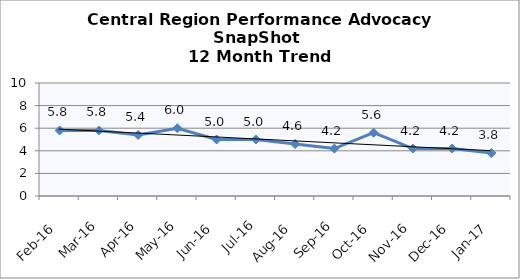
| Category | Central Region |
|---|---|
| Feb-16 | 5.8 |
| Mar-16 | 5.8 |
| Apr-16 | 5.4 |
| May-16 | 6 |
| Jun-16 | 5 |
| Jul-16 | 5 |
| Aug-16 | 4.6 |
| Sep-16 | 4.2 |
| Oct-16 | 5.6 |
| Nov-16 | 4.2 |
| Dec-16 | 4.2 |
| Jan-17 | 3.8 |